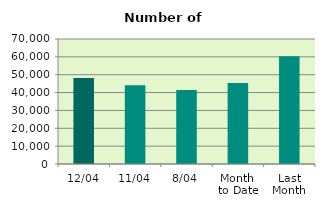
| Category | Series 0 |
|---|---|
| 12/04 | 48196 |
| 11/04 | 44166 |
| 8/04 | 41436 |
| Month 
to Date | 45397.5 |
| Last
Month | 60380.087 |